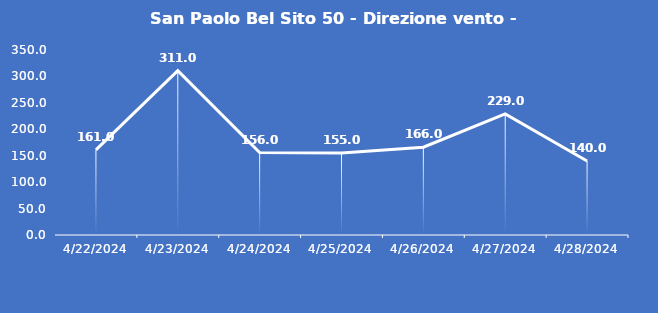
| Category | San Paolo Bel Sito 50 - Direzione vento - Grezzo (°N) |
|---|---|
| 4/22/24 | 161 |
| 4/23/24 | 311 |
| 4/24/24 | 156 |
| 4/25/24 | 155 |
| 4/26/24 | 166 |
| 4/27/24 | 229 |
| 4/28/24 | 140 |